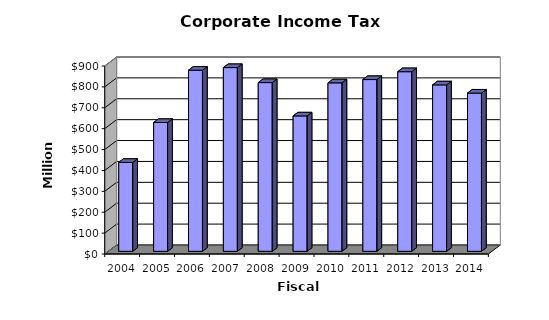
| Category | Amount |
|---|---|
| 2004.0 | 425715754 |
| 2005.0 | 616690263 |
| 2006.0 | 867115786 |
| 2007.0 | 879575371 |
| 2008.0 | 807851584 |
| 2009.0 | 648032537 |
| 2010.0 | 806472760 |
| 2011.0 | 822258802.84 |
| 2012.0 | 859922839.55 |
| 2013.0 | 796728154.4 |
| 2014.0 | 757490742.09 |